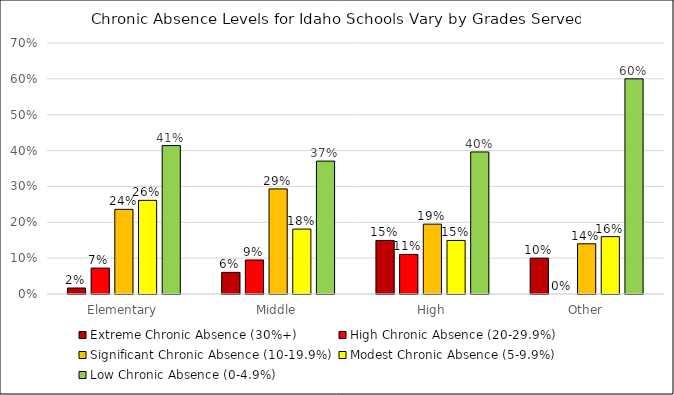
| Category | Extreme Chronic Absence (30%+) | High Chronic Absence (20-29.9%) | Significant Chronic Absence (10-19.9%) | Modest Chronic Absence (5-9.9%) | Low Chronic Absence (0-4.9%) |
|---|---|---|---|---|---|
| Elementary | 0.017 | 0.072 | 0.236 | 0.261 | 0.414 |
| Middle | 0.06 | 0.095 | 0.293 | 0.181 | 0.371 |
| High | 0.149 | 0.11 | 0.195 | 0.149 | 0.396 |
| Other | 0.1 | 0 | 0.14 | 0.16 | 0.6 |